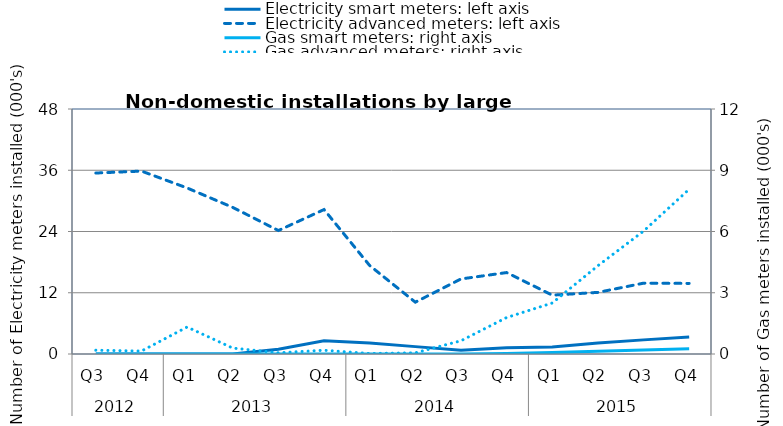
| Category | Electricity smart meters: left axis | Electricity advanced meters: left axis |
|---|---|---|
| 0 | 0 | 35455 |
| 1 | 0 | 35834 |
| 2 | 0 | 32529 |
| 3 | 0 | 28722 |
| 4 | 946 | 24189 |
| 5 | 2590 | 28300 |
| 6 | 2175 | 17332 |
| 7 | 1445 | 10152 |
| 8 | 714 | 14700 |
| 9 | 1214 | 15955 |
| 10 | 1369 | 11531 |
| 11 | 2137 | 12072 |
| 12 | 2767 | 13877 |
| 13 | 3347 | 13828 |